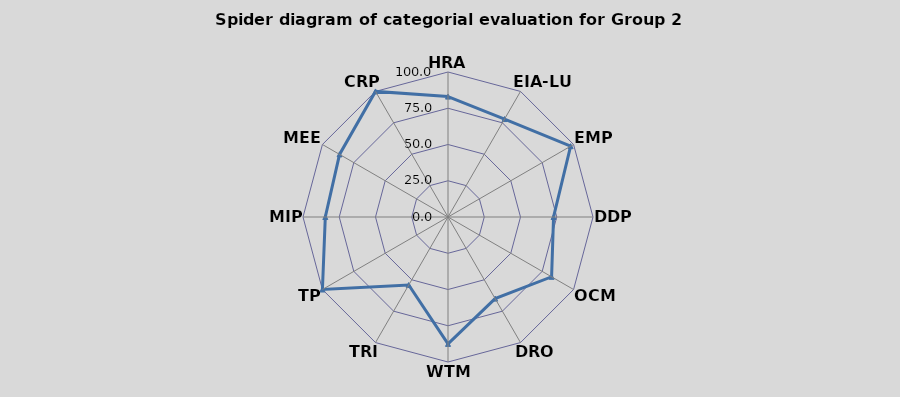
| Category | B2 |
|---|---|
| HRA | 83.036 |
| EIA-LUP | 78 |
| EMP | 97.656 |
| DDP | 72.794 |
| OCM | 82.5 |
| DRO | 65 |
| WTM | 87.5 |
| TRI | 54.167 |
| TP | 100 |
| MIP | 84.615 |
| MEE | 86.364 |
| CRP | 100 |